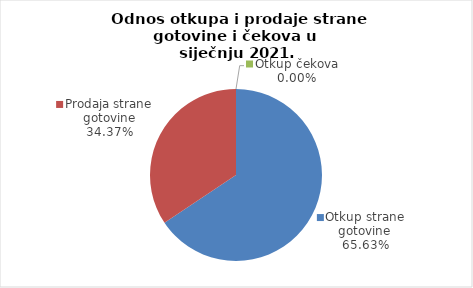
| Category | Series 0 |
|---|---|
| Otkup strane gotovine | 65.628 |
| Prodaja strane gotovine | 34.372 |
| Otkup čekova | 0 |